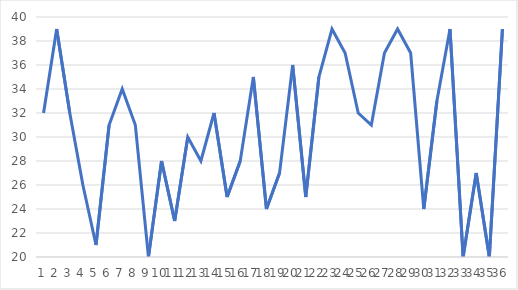
| Category | Series 0 |
|---|---|
| 0 | 32 |
| 1 | 39 |
| 2 | 32 |
| 3 | 26 |
| 4 | 21 |
| 5 | 31 |
| 6 | 34 |
| 7 | 31 |
| 8 | 20 |
| 9 | 28 |
| 10 | 23 |
| 11 | 30 |
| 12 | 28 |
| 13 | 32 |
| 14 | 25 |
| 15 | 28 |
| 16 | 35 |
| 17 | 24 |
| 18 | 27 |
| 19 | 36 |
| 20 | 25 |
| 21 | 35 |
| 22 | 39 |
| 23 | 37 |
| 24 | 32 |
| 25 | 31 |
| 26 | 37 |
| 27 | 39 |
| 28 | 37 |
| 29 | 24 |
| 30 | 33 |
| 31 | 39 |
| 32 | 20 |
| 33 | 27 |
| 34 | 20 |
| 35 | 39 |